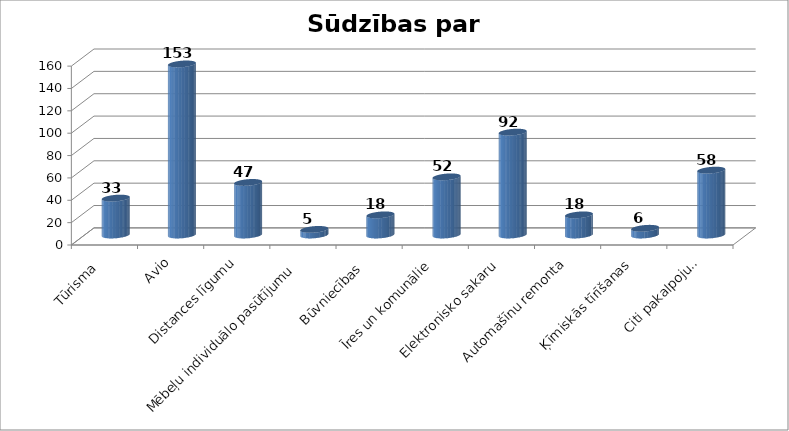
| Category | Series 0 |
|---|---|
| Tūrisma  | 33 |
| Avio | 153 |
| Distances līgumu | 47 |
| Mēbeļu individuālo pasūtījumu  | 5 |
| Būvniecības  | 18 |
| Īres un komunālie  | 52 |
| Elektronisko sakaru | 92 |
| Automašīnu remonta | 18 |
| Ķīmiskās tīrīšanas  | 6 |
| Citi pakalpojumi | 58 |